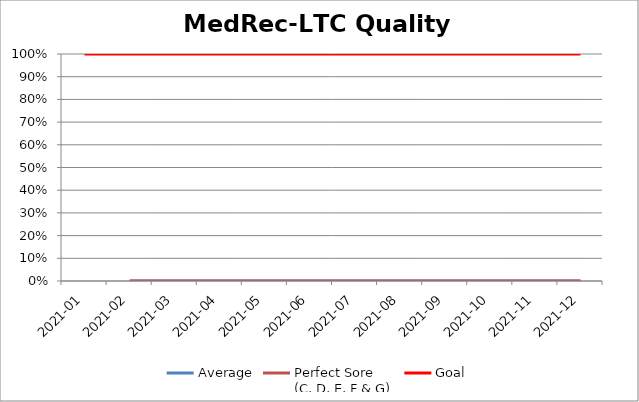
| Category | Average | Perfect Sore 
(C, D, E, F & G) | Goal |
|---|---|---|---|
| 2021-01 | 0 | 0 | 1 |
| 2021-02 | 0 | 0 | 1 |
| 2021-03 | 0 | 0 | 1 |
| 2021-04 | 0 | 0 | 1 |
| 2021-05 | 0 | 0 | 1 |
| 2021-06 | 0 | 0 | 1 |
| 2021-07 | 0 | 0 | 1 |
| 2021-08 | 0 | 0 | 1 |
| 2021-09 | 0 | 0 | 1 |
| 2021-10 | 0 | 0 | 1 |
| 2021-11 | 0 | 0 | 1 |
| 2021-12 | 0 | 0 | 1 |